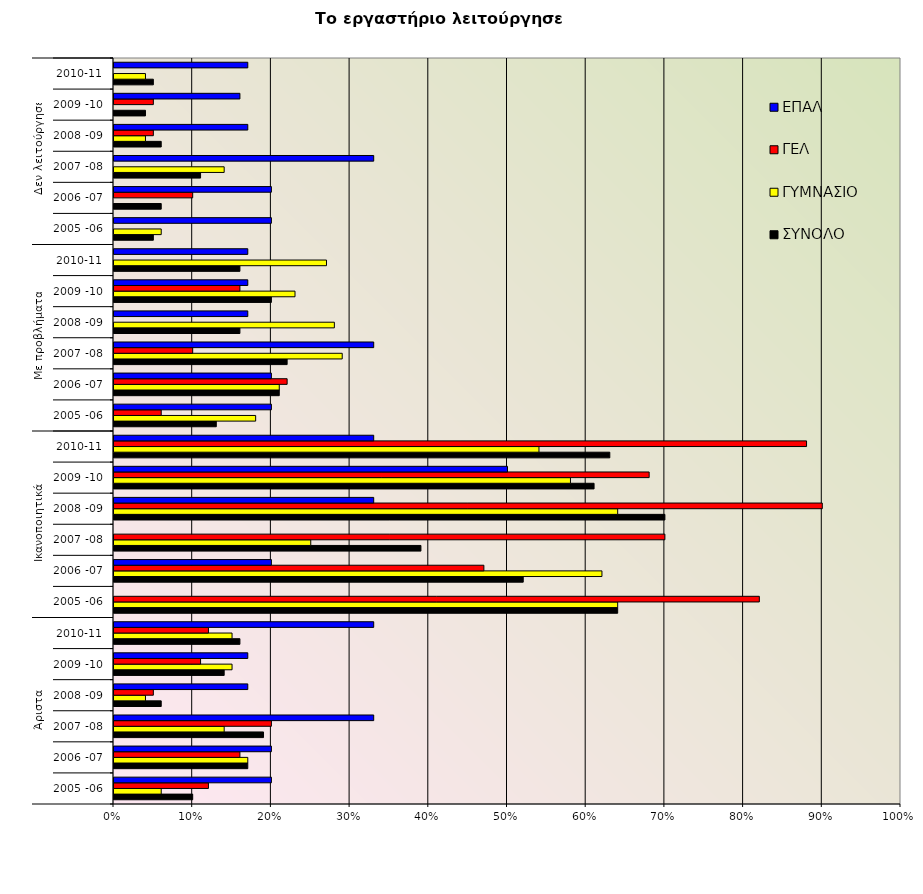
| Category | ΣΥΝΟΛΟ | ΓΥΜΝΑΣΙΟ | ΓΕΛ | ΕΠΑΛ |
|---|---|---|---|---|
| 0 | 0.1 | 0.06 | 0.12 | 0.2 |
| 1 | 0.17 | 0.17 | 0.16 | 0.2 |
| 2 | 0.19 | 0.14 | 0.2 | 0.33 |
| 3 | 0.06 | 0.04 | 0.05 | 0.17 |
| 4 | 0.14 | 0.15 | 0.11 | 0.17 |
| 5 | 0.16 | 0.15 | 0.12 | 0.33 |
| 6 | 0.64 | 0.64 | 0.82 | 0 |
| 7 | 0.52 | 0.62 | 0.47 | 0.2 |
| 8 | 0.39 | 0.25 | 0.7 | 0 |
| 9 | 0.7 | 0.64 | 0.9 | 0.33 |
| 10 | 0.61 | 0.58 | 0.68 | 0.5 |
| 11 | 0.63 | 0.54 | 0.88 | 0.33 |
| 12 | 0.13 | 0.18 | 0.06 | 0.2 |
| 13 | 0.21 | 0.21 | 0.22 | 0.2 |
| 14 | 0.22 | 0.29 | 0.1 | 0.33 |
| 15 | 0.16 | 0.28 | 0 | 0.17 |
| 16 | 0.2 | 0.23 | 0.16 | 0.17 |
| 17 | 0.16 | 0.27 | 0 | 0.17 |
| 18 | 0.05 | 0.06 | 0 | 0.2 |
| 19 | 0.06 | 0 | 0.1 | 0.2 |
| 20 | 0.11 | 0.14 | 0 | 0.33 |
| 21 | 0.06 | 0.04 | 0.05 | 0.17 |
| 22 | 0.04 | 0 | 0.05 | 0.16 |
| 23 | 0.05 | 0.04 | 0 | 0.17 |